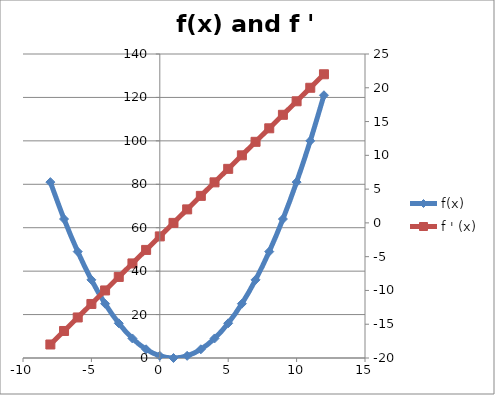
| Category | f(x) |
|---|---|
| -8.0 | 81 |
| -7.0 | 64 |
| -6.0 | 49 |
| -5.0 | 36 |
| -4.0 | 25 |
| -3.0 | 16 |
| -2.0 | 9 |
| -1.0 | 4 |
| 0.0 | 1 |
| 1.0 | 0 |
| 2.0 | 1 |
| 3.0 | 4 |
| 4.0 | 9 |
| 5.0 | 16 |
| 6.0 | 25 |
| 7.0 | 36 |
| 8.0 | 49 |
| 9.0 | 64 |
| 10.0 | 81 |
| 11.0 | 100 |
| 12.0 | 121 |